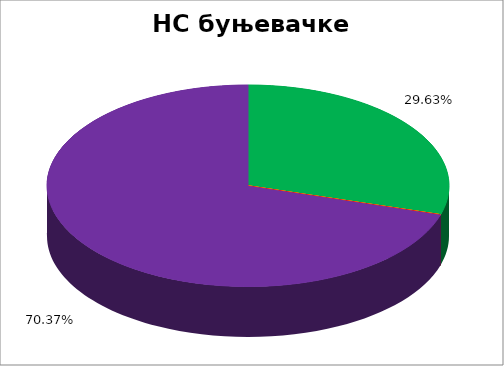
| Category | НС буњевачке НМ |
|---|---|
| 0 | 0.296 |
| 1 | 0 |
| 2 | 0 |
| 3 | 0 |
| 4 | 0.704 |